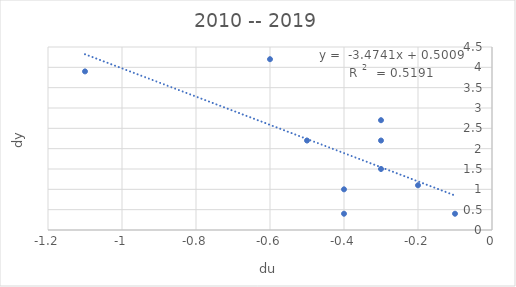
| Category | dy |
|---|---|
| -0.6000000000000005 | 4.2 |
| -1.0999999999999996 | 3.9 |
| -0.40000000000000036 | 0.4 |
| -0.09999999999999964 | 0.4 |
| -0.2999999999999998 | 2.2 |
| -0.2999999999999998 | 1.5 |
| -0.5000000000000004 | 2.2 |
| -0.2999999999999998 | 2.7 |
| -0.3999999999999999 | 1 |
| -0.20000000000000018 | 1.1 |